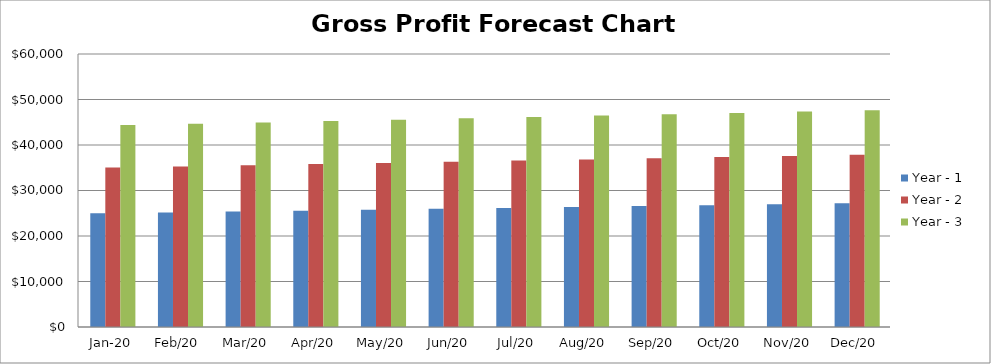
| Category | Year - 1 | Year - 2 | Year - 3 |
|---|---|---|---|
| 2020-01-01 | 24975 | 35044.6 | 44372.2 |
| 2020-02-01 | 25174.8 | 35300.4 | 44670 |
| 2020-03-01 | 25374.6 | 35556.2 | 44967.8 |
| 2020-04-01 | 25574.4 | 35812 | 45265.6 |
| 2020-05-01 | 25774.2 | 36067.8 | 45563.4 |
| 2020-06-01 | 25974 | 36323.6 | 45861.2 |
| 2020-07-01 | 26173.8 | 36579.4 | 46159 |
| 2020-08-01 | 26373.6 | 36835.2 | 46456.8 |
| 2020-09-01 | 26573.4 | 37091 | 46754.6 |
| 2020-10-01 | 26773.2 | 37346.8 | 47052.4 |
| 2020-11-01 | 26973 | 37602.6 | 47350.2 |
| 2020-12-01 | 27172.8 | 37858.4 | 47648 |